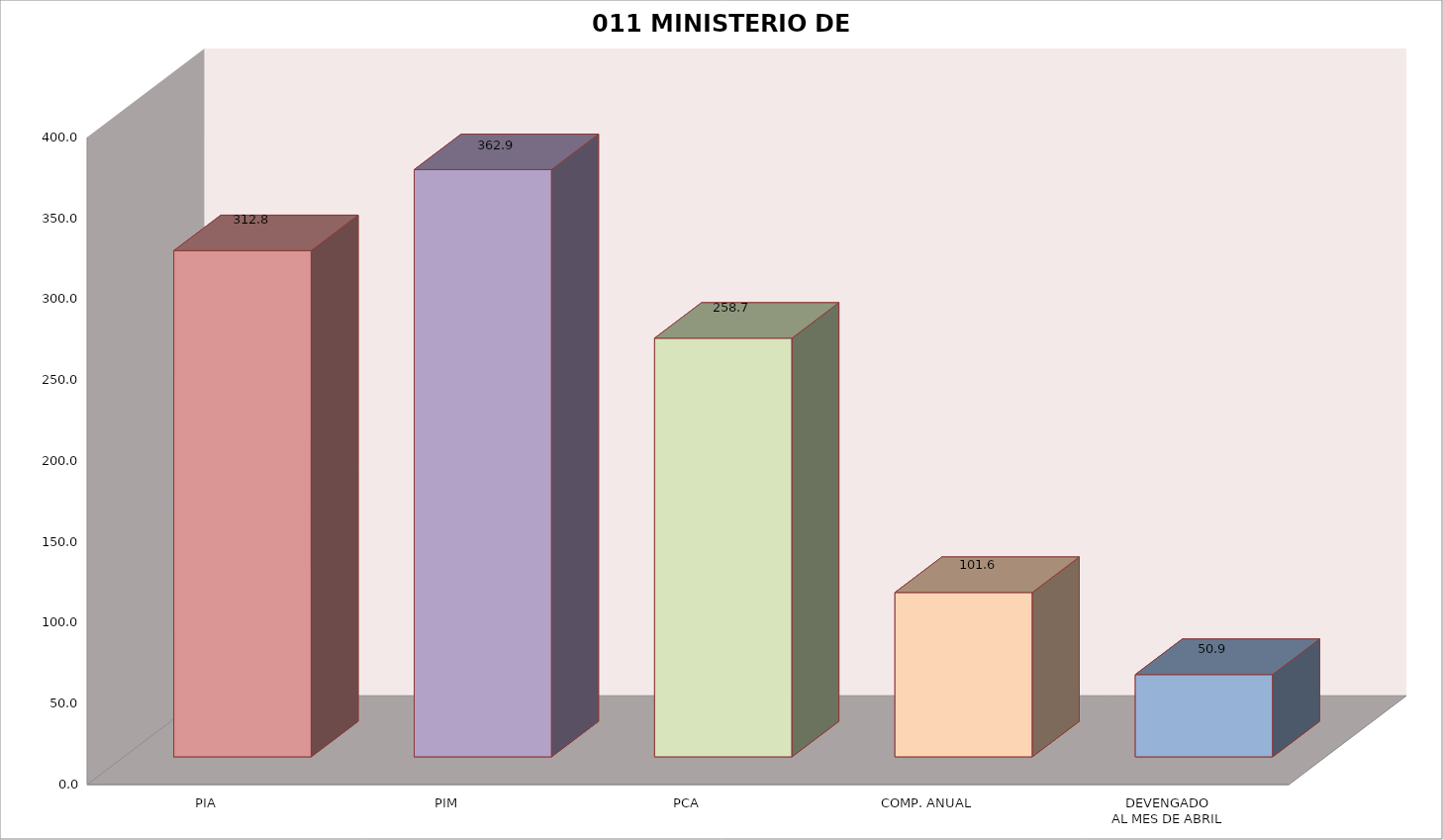
| Category | 011 MINISTERIO DE SALUD |
|---|---|
| PIA | 312.801 |
| PIM | 362.893 |
| PCA | 258.721 |
| COMP. ANUAL | 101.565 |
| DEVENGADO
AL MES DE ABRIL | 50.855 |